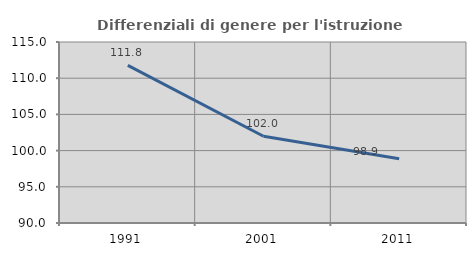
| Category | Differenziali di genere per l'istruzione superiore |
|---|---|
| 1991.0 | 111.77 |
| 2001.0 | 101.987 |
| 2011.0 | 98.864 |